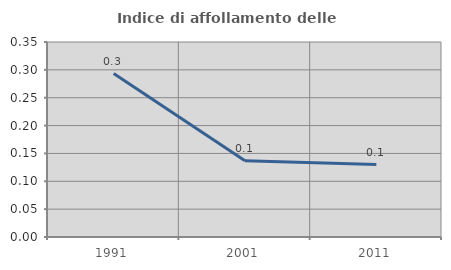
| Category | Indice di affollamento delle abitazioni  |
|---|---|
| 1991.0 | 0.293 |
| 2001.0 | 0.137 |
| 2011.0 | 0.13 |